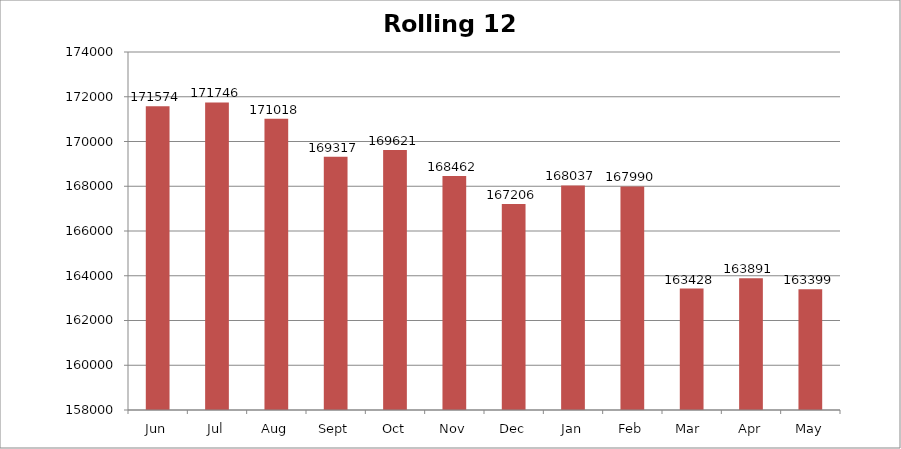
| Category | Rolling 12 Month |
|---|---|
| Jun | 171574 |
| Jul | 171746 |
| Aug | 171018 |
| Sept | 169317 |
| Oct | 169621 |
| Nov | 168462 |
| Dec | 167206 |
| Jan | 168037 |
| Feb | 167990 |
| Mar  | 163428 |
| Apr | 163891 |
| May | 163399 |